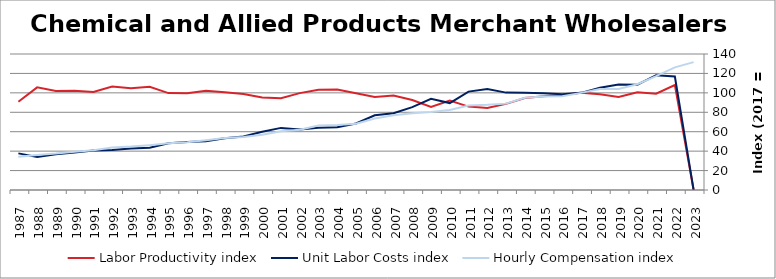
| Category | Labor Productivity index | Unit Labor Costs index | Hourly Compensation index |
|---|---|---|---|
| 2023.0 | 0 | 0 | 131.607 |
| 2022.0 | 108.029 | 116.852 | 126.234 |
| 2021.0 | 99.171 | 118.158 | 117.178 |
| 2020.0 | 100.508 | 108.335 | 108.885 |
| 2019.0 | 95.852 | 108.553 | 104.05 |
| 2018.0 | 98.612 | 105.316 | 103.855 |
| 2017.0 | 100 | 100 | 100 |
| 2016.0 | 97.894 | 98.619 | 96.542 |
| 2015.0 | 96.564 | 99.578 | 96.156 |
| 2014.0 | 94.724 | 100.209 | 94.922 |
| 2013.0 | 88.694 | 100.244 | 88.911 |
| 2012.0 | 84.338 | 103.981 | 87.695 |
| 2011.0 | 85.831 | 101.297 | 86.945 |
| 2010.0 | 92.055 | 89.493 | 82.383 |
| 2009.0 | 85.463 | 93.921 | 80.268 |
| 2008.0 | 92.628 | 85.351 | 79.058 |
| 2007.0 | 97.37 | 78.957 | 76.881 |
| 2006.0 | 95.647 | 76.883 | 73.537 |
| 2005.0 | 99.547 | 68.445 | 68.135 |
| 2004.0 | 103.428 | 64.672 | 66.89 |
| 2003.0 | 103.295 | 64.177 | 66.292 |
| 2002.0 | 99.727 | 62.31 | 62.14 |
| 2001.0 | 94.528 | 63.936 | 60.438 |
| 2000.0 | 95.113 | 59.879 | 56.953 |
| 1999.0 | 98.904 | 55.075 | 54.472 |
| 1998.0 | 100.521 | 53.224 | 53.502 |
| 1997.0 | 102.129 | 50.12 | 51.188 |
| 1996.0 | 99.589 | 49.483 | 49.279 |
| 1995.0 | 99.749 | 48.145 | 48.024 |
| 1994.0 | 106.217 | 43.465 | 46.168 |
| 1993.0 | 104.737 | 42.668 | 44.689 |
| 1992.0 | 106.437 | 41.134 | 43.782 |
| 1991.0 | 100.821 | 40.698 | 41.032 |
| 1990.0 | 102.242 | 38.58 | 39.445 |
| 1989.0 | 101.821 | 36.802 | 37.472 |
| 1988.0 | 105.634 | 34.016 | 35.932 |
| 1987.0 | 90.769 | 37.691 | 34.211 |